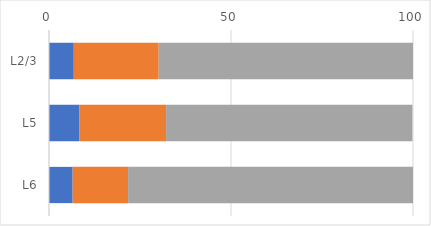
| Category | Series 0 | Series 1 | Series 2 |
|---|---|---|---|
| L2/3 | 6.808 | 23.331 | 70.244 |
| L5 | 8.39 | 23.78 | 67.673 |
| L6 | 6.5 | 15.232 | 78.267 |